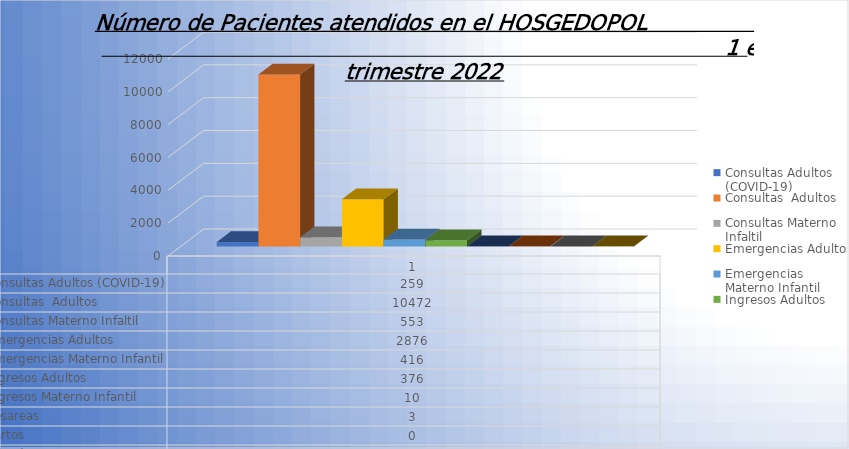
| Category | Consultas Adultos (COVID-19) | Consultas  Adultos | Consultas Materno Infaltil | Emergencias Adultos | Emergencias Materno Infantil | Ingresos Adultos  | Ingresos Materno Infantil | Cesareas | partos | legrados |
|---|---|---|---|---|---|---|---|---|---|---|
| 0 | 259 | 10472 | 553 | 2876 | 416 | 376 | 10 | 3 | 0 | 7 |